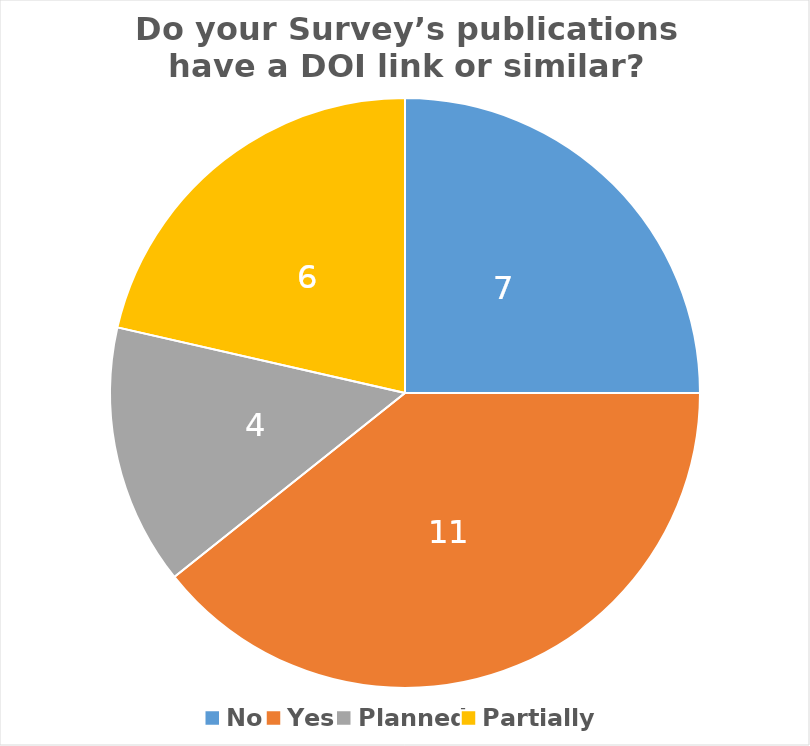
| Category | Series 0 |
|---|---|
| No | 7 |
| Yes | 11 |
| Planned | 4 |
| Partially | 6 |